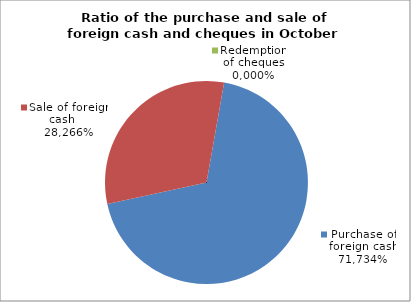
| Category | Purchase of foreign cash |
|---|---|
| 0 | 0.688 |
| 1 | 0.312 |
| 2 | 0 |